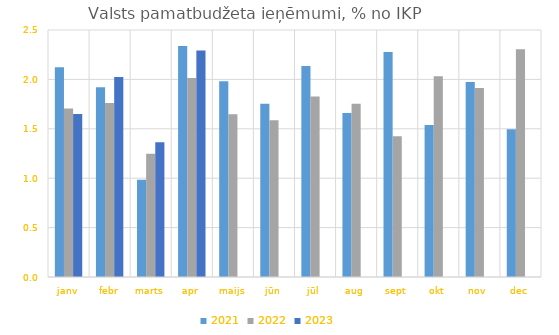
| Category | 2021 | 2022 | 2023 |
|---|---|---|---|
| janv | 2.123 | 1.706 | 1.65 |
| febr | 1.92 | 1.76 | 2.025 |
| marts | 0.984 | 1.248 | 1.364 |
| apr | 2.339 | 2.014 | 2.293 |
| maijs | 1.981 | 1.648 | 0 |
| jūn | 1.754 | 1.587 | 0 |
| jūl | 2.136 | 1.827 | 0 |
| aug | 1.659 | 1.753 | 0 |
| sept | 2.276 | 1.424 | 0 |
| okt | 1.539 | 2.032 | 0 |
| nov | 1.973 | 1.914 | 0 |
| dec | 1.496 | 2.305 | 0 |